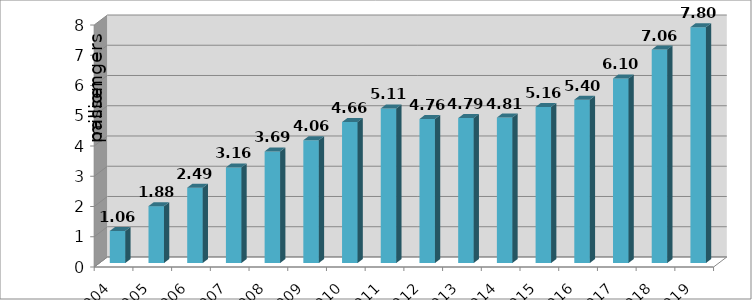
| Category | Series 0 |
|---|---|
| 2004.0 | 1.06 |
| 2005.0 | 1.88 |
| 2006.0 | 2.49 |
| 2007.0 | 3.16 |
| 2008.0 | 3.69 |
| 2009.0 | 4.06 |
| 2010.0 | 4.66 |
| 2011.0 | 5.11 |
| 2012.0 | 4.76 |
| 2013.0 | 4.79 |
| 2014.0 | 4.81 |
| 2015.0 | 5.16 |
| 2016.0 | 5.4 |
| 2017.0 | 6.1 |
| 2018.0 | 7.056 |
| 2019.0 | 7.797 |